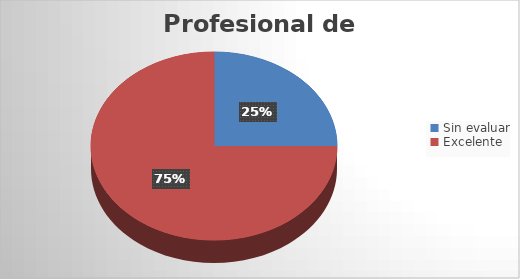
| Category | Cantidad |
|---|---|
| Sin evaluar | 1 |
| Excelente | 3 |